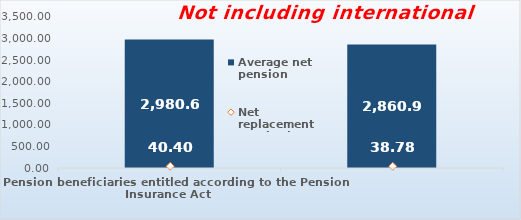
| Category | Average net pension  |
|---|---|
| Pension beneficiaries entitled according to the Pension Insurance Act   | 2980.62 |
| Pension beneficiaries entitled to pension FOR THE FIRST TIME in 2022 according to the Pension Insurance Act  - NEW BENEFICIARIES | 2860.933 |